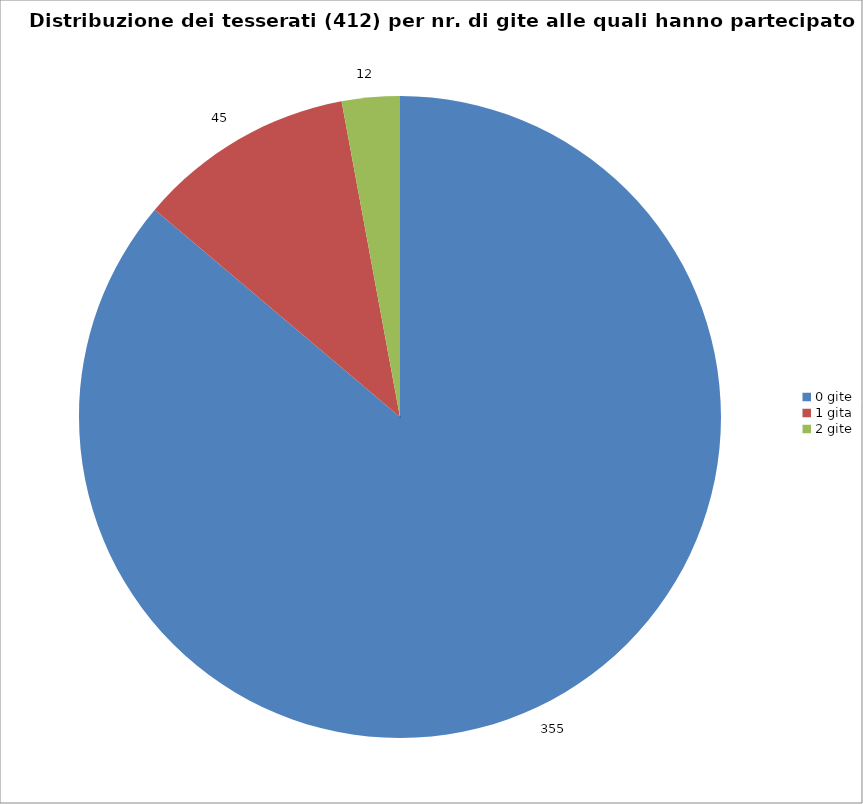
| Category | Nr. Tesserati |
|---|---|
| 0 gite | 355 |
| 1 gita | 45 |
| 2 gite | 12 |